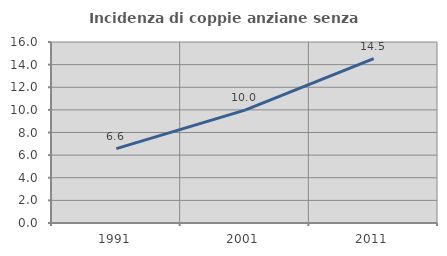
| Category | Incidenza di coppie anziane senza figli  |
|---|---|
| 1991.0 | 6.576 |
| 2001.0 | 9.983 |
| 2011.0 | 14.53 |